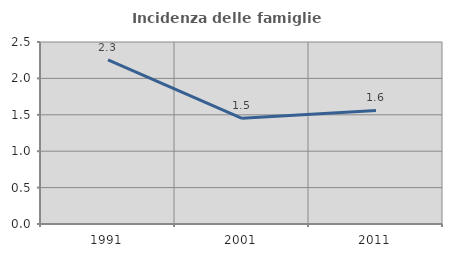
| Category | Incidenza delle famiglie numerose |
|---|---|
| 1991.0 | 2.256 |
| 2001.0 | 1.452 |
| 2011.0 | 1.56 |